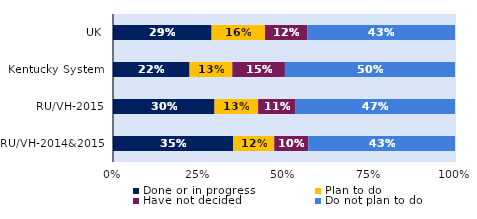
| Category | Done or in progress | Plan to do | Have not decided | Do not plan to do |
|---|---|---|---|---|
| UK | 0.288 | 0.156 | 0.123 | 0.432 |
| Kentucky System | 0.224 | 0.125 | 0.154 | 0.497 |
| RU/VH-2015 | 0.297 | 0.128 | 0.109 | 0.466 |
| RU/VH-2014&2015 | 0.352 | 0.12 | 0.1 | 0.429 |